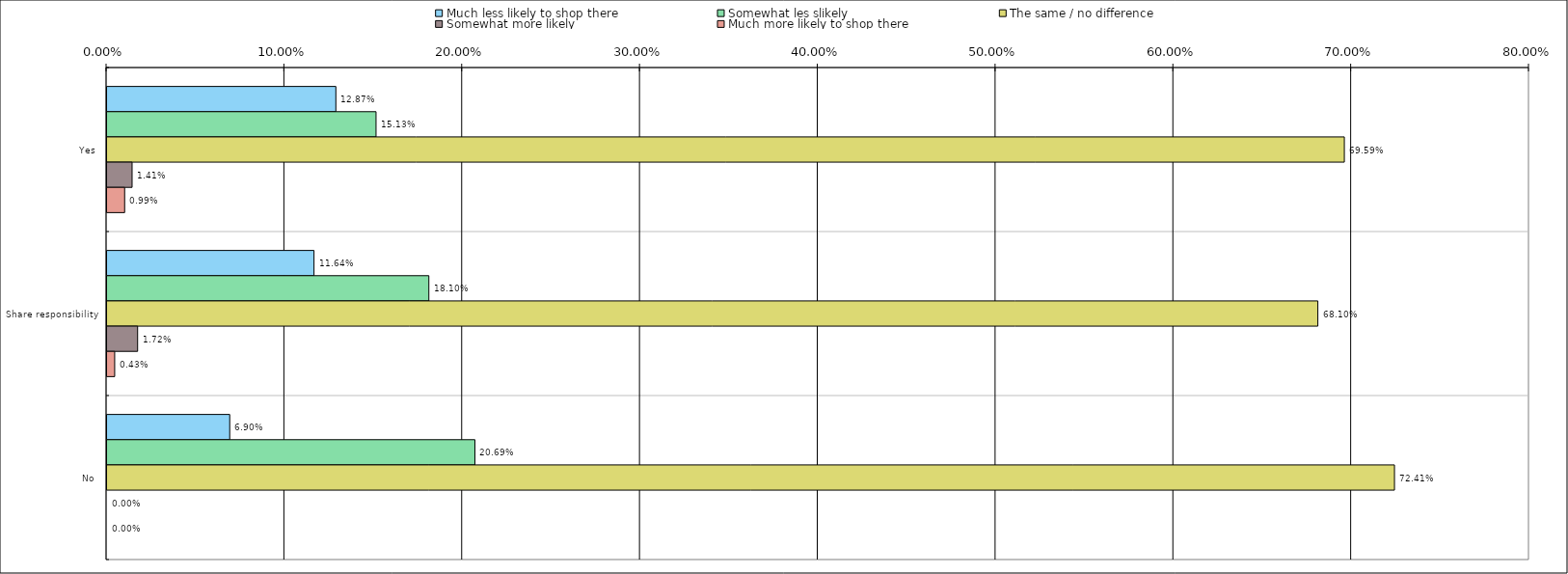
| Category | Much less likely to shop there | Somewhat les slikely | The same / no difference | Somewhat more likely | Much more likely to shop there |
|---|---|---|---|---|---|
| 0 | 0.129 | 0.151 | 0.696 | 0.014 | 0.01 |
| 1 | 0.116 | 0.181 | 0.681 | 0.017 | 0.004 |
| 2 | 0.069 | 0.207 | 0.724 | 0 | 0 |